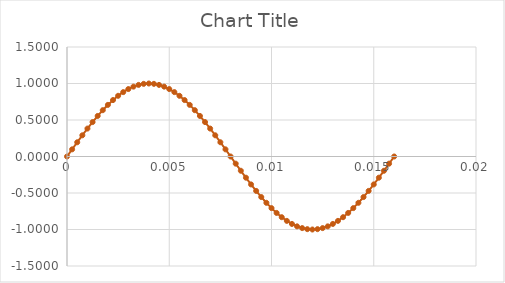
| Category | Series 0 |
|---|---|
| 0.0 | 0 |
| 0.00025 | 0.098 |
| 0.0005 | 0.195 |
| 0.00075 | 0.29 |
| 0.001 | 0.383 |
| 0.00125 | 0.471 |
| 0.0015 | 0.556 |
| 0.00175 | 0.634 |
| 0.002 | 0.707 |
| 0.00225 | 0.773 |
| 0.0025 | 0.831 |
| 0.00275 | 0.882 |
| 0.003 | 0.924 |
| 0.00325 | 0.957 |
| 0.0035 | 0.981 |
| 0.00375 | 0.995 |
| 0.004 | 1 |
| 0.00425 | 0.995 |
| 0.0045 | 0.981 |
| 0.00475 | 0.957 |
| 0.005 | 0.924 |
| 0.00525 | 0.882 |
| 0.0055 | 0.831 |
| 0.00575 | 0.773 |
| 0.006 | 0.707 |
| 0.00625 | 0.634 |
| 0.0065 | 0.556 |
| 0.00675 | 0.471 |
| 0.007 | 0.383 |
| 0.00725 | 0.29 |
| 0.0075 | 0.195 |
| 0.00775 | 0.098 |
| 0.008 | 0 |
| 0.00825 | -0.098 |
| 0.0085 | -0.195 |
| 0.00875 | -0.29 |
| 0.009 | -0.383 |
| 0.00925 | -0.471 |
| 0.0095 | -0.556 |
| 0.00975 | -0.634 |
| 0.01 | -0.707 |
| 0.01025 | -0.773 |
| 0.0105 | -0.831 |
| 0.01075 | -0.882 |
| 0.011 | -0.924 |
| 0.01125 | -0.957 |
| 0.0115 | -0.981 |
| 0.01175 | -0.995 |
| 0.012 | -1 |
| 0.01225 | -0.995 |
| 0.0125 | -0.981 |
| 0.01275 | -0.957 |
| 0.013 | -0.924 |
| 0.01325 | -0.882 |
| 0.0135 | -0.831 |
| 0.01375 | -0.773 |
| 0.014 | -0.707 |
| 0.01425 | -0.634 |
| 0.0145 | -0.556 |
| 0.01475 | -0.471 |
| 0.015 | -0.383 |
| 0.01525 | -0.29 |
| 0.0155 | -0.195 |
| 0.01575 | -0.098 |
| 0.016 | 0 |